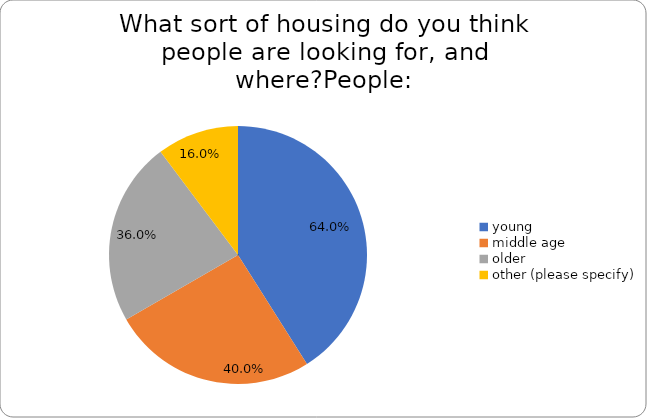
| Category | Series 0 |
|---|---|
| young | 0.64 |
| middle age | 0.4 |
| older | 0.36 |
| other (please specify) | 0.16 |